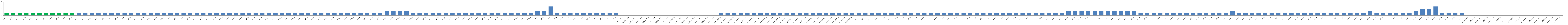
| Category | Series 0 |
|---|---|
| AW01 | 1 |
| AW02 | 1 |
| AW03 | 1 |
| AW04 | 1 |
| AW05 | 1 |
| AW06 | 1 |
| AW07 | 1 |
| AW08 | 1 |
| AW09 | 1 |
| AW10 | 1 |
| AW11 | 1 |
| AW12 | 1 |
| AW13 | 1 |
| AW14 | 1 |
| AW15 | 1 |
| AW16 | 1 |
| AW17 | 1 |
| AW18 | 1 |
| AW19 | 1 |
| AW20 | 1 |
| AW21 | 1 |
| AW22 | 1 |
| AW23 | 1 |
| AW24 | 1 |
| AW25 | 1 |
| AW26 | 1 |
| AW27 | 1 |
| AW28 | 1 |
| AW29 | 1 |
| BW01 | 1 |
| BW02 | 1 |
| BW03 | 1 |
| BWO4 | 1 |
| BW05 | 1 |
| BW06 | 1 |
| BW07 | 1 |
| BW08 | 1 |
| BW09 | 1 |
| BW10 | 1 |
| BW11 | 1 |
| BW12 | 1 |
| BW13 | 1 |
| BW14 | 1 |
| BW15 | 1 |
| BW16 | 1 |
| BW17 | 1 |
| BW18 | 1 |
| BW19 | 1 |
| BW20 | 1 |
| BW21 | 1 |
| BW22 | 1 |
| BW23 | 1 |
| BW24 | 1 |
| BW25 | 1 |
| BW26 | 1 |
| BW27 | 1 |
| BW28 | 1 |
| BW29 | 1 |
| BW30 | 2 |
| BW31 | 2 |
| BW32 | 2 |
| BW33 | 2 |
| BW34 | 1 |
| BW35 | 1 |
| BW36 | 1 |
| BW37 | 1 |
| BW38 | 1 |
| BW39 | 1 |
| BW40 | 1 |
| BW41 | 1 |
| BW42 | 1 |
| BW43 | 1 |
| BW44 | 1 |
| BW45 | 1 |
| BW46 | 1 |
| BW47 | 1 |
| BW48 | 1 |
| BW49 | 1 |
| BW50 | 1 |
| BW51 | 1 |
| BW52 | 1 |
| CW01 | 2 |
| CW02 | 2 |
| CW03 | 4 |
| CW04 | 1 |
| CW05 | 1 |
| CW06 | 1 |
| CW07 | 1 |
| CW08 | 1 |
| CW09 | 1 |
| CW10 | 1 |
| CW11 | 1 |
| CW12 | 1 |
| CW13 | 1 |
| AUMED. W01 | 0 |
| AUMED. W02 | 0 |
| AUMED. W03 | 0 |
| AUMED. W04 | 0 |
| AUMED. W05 | 0 |
| AUMED. W06 | 0 |
| AUMED. W07 | 0 |
| AUMED. W08 | 0 |
| AUMED.W09 | 0 |
| AUMED. W10 | 0 |
| AUMED. W11 | 0 |
| AUMED. W12 | 0 |
| AUMED. W13 | 0 |
| AUMED. W14 | 0 |
| AUMED. W15 | 0 |
| BUMED.W01 | 1 |
| BUMED.W02 | 1 |
| BUMED.W03 | 1 |
| BUMED.W04 | 1 |
| BUMED.W05 | 1 |
| BUMED.W06 | 1 |
| BUMED.W07 | 1 |
| BUMED.W08 | 1 |
| BUMED.W09 | 1 |
| BUMED.W10 | 1 |
| BUMED.W11 | 1 |
| BUMED.W12 | 1 |
| BUMED.W13 | 1 |
| BUMED.W14 | 1 |
| BUMED.W15 | 1 |
| BUMED.W16 | 1 |
| BUMED.W17 | 1 |
| BUMED.W18 | 1 |
| BUMED.W19 | 1 |
| BUMED.W20 | 1 |
| BUMED.W21 | 1 |
| AW22* | 1 |
| AW23* | 1 |
| AW24* | 1 |
| AW25* | 1 |
| AU01 | 1 |
| AU02 | 1 |
| AU03 | 1 |
| AU04 | 1 |
| AU05 | 1 |
| AU06 | 1 |
| AU07 | 1 |
| AU08 | 1 |
| AU09 | 1 |
| AU10 | 1 |
| AU11 | 1 |
| AU12 | 1 |
| AU13 | 1 |
| AU14 | 1 |
| AU15 | 1 |
| AU16 | 1 |
| AU17 | 1 |
| AU18 | 1 |
| AU19 | 1 |
| AU20 | 1 |
| AU21 | 1 |
| BU01 | 1 |
| BU02 | 1 |
| BU03 | 1 |
| BU04 | 1 |
| BU05 | 1 |
| BU06 | 1 |
| BU07 | 1 |
| BU08 | 2 |
| BU09 | 2 |
| BU10 | 2 |
| BU11 | 2 |
| BU12 | 2 |
| BU13 | 2 |
| BU14 | 2 |
| BU15 | 2 |
| BU16 | 2 |
| BU17 | 2 |
| BU18 | 2 |
| BU19 | 1 |
| BU20 | 1 |
| BU21 | 1 |
| BU22 | 1 |
| BU23 | 1 |
| BU24 | 1 |
| BU25 | 1 |
| BU26 | 1 |
| BU27 | 1 |
| BU28 | 1 |
| BU29 | 1 |
| BU30 | 1 |
| BU31 | 1 |
| BU32 | 1 |
| BU33 | 2 |
| BU34 | 1 |
| BU35 | 1 |
| BU36 | 1 |
| BU37 | 1 |
| BU38 | 1 |
| BU39 | 1 |
| BU40 | 1 |
| BU41 | 1 |
| BU42 | 1 |
| BU43 | 1 |
| BU44 | 1 |
| BU45 | 1 |
| BU46 | 1 |
| BU47 | 1 |
| BU48 | 1 |
| BU49 | 1 |
| BU50 | 1 |
| BU51 | 1 |
| BU52 | 1 |
| BU53 | 1 |
| BU54 | 2 |
| BU55 | 1 |
| BU56 | 1 |
| BU57 | 1 |
| BU58 | 1 |
| BU59 | 1 |
| BU60 | 1 |
| BU61 | 2 |
| CU01 | 3 |
| CU02 | 3 |
| CU03 | 4 |
| CU04 | 1 |
| CU05 | 1 |
| CU06 | 1 |
| CU07 | 1 |
| AUMED.U01 | 0 |
| AUMED.U02 | 0 |
| AUMED.U03 | 0 |
| AUMED.U04 | 0 |
| AUMED.U05 | 0 |
| AUMED.U06 | 0 |
| AUMED.U07 | 0 |
| AUMED.U08 | 0 |
| AUMED.U09 | 0 |
| AUMED.U10 | 0 |
| AUMED.U11 | 0 |
| AUMED.U12 | 0 |
| AUMED.U13 | 0 |
| AUMED.U14 | 0 |
| AUMED.U15 | 0 |